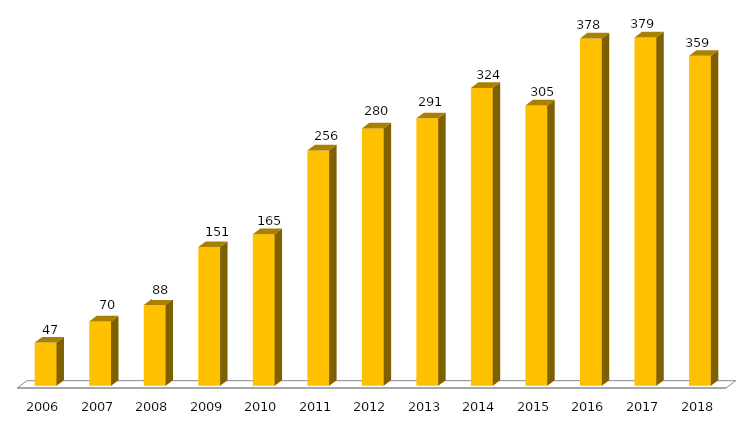
| Category | Programa |
|---|---|
| 2006.0 | 47 |
| 2007.0 | 70 |
| 2008.0 | 88 |
| 2009.0 | 151 |
| 2010.0 | 165 |
| 2011.0 | 256 |
| 2012.0 | 280 |
| 2013.0 | 291 |
| 2014.0 | 324 |
| 2015.0 | 305 |
| 2016.0 | 378 |
| 2017.0 | 379 |
| 2018.0 | 359 |